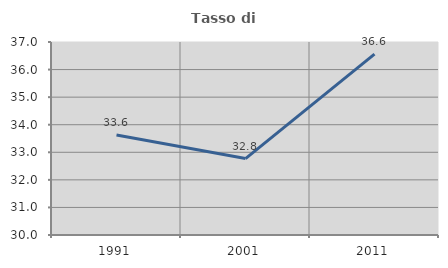
| Category | Tasso di occupazione   |
|---|---|
| 1991.0 | 33.627 |
| 2001.0 | 32.772 |
| 2011.0 | 36.558 |